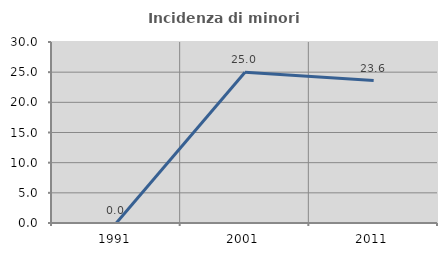
| Category | Incidenza di minori stranieri |
|---|---|
| 1991.0 | 0 |
| 2001.0 | 25 |
| 2011.0 | 23.611 |